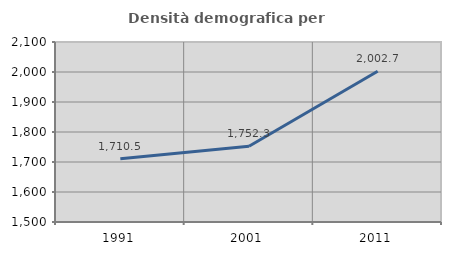
| Category | Densità demografica |
|---|---|
| 1991.0 | 1710.451 |
| 2001.0 | 1752.316 |
| 2011.0 | 2002.721 |